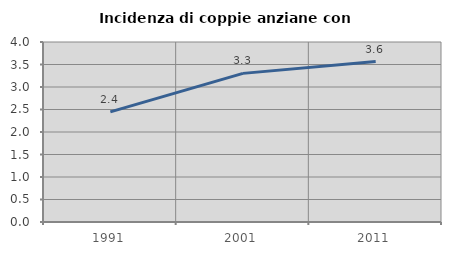
| Category | Incidenza di coppie anziane con figli |
|---|---|
| 1991.0 | 2.446 |
| 2001.0 | 3.303 |
| 2011.0 | 3.565 |